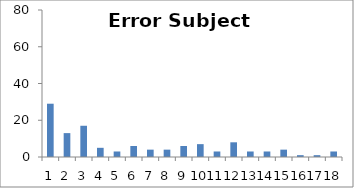
| Category | Sub13 |
|---|---|
| 0 | 29 |
| 1 | 13 |
| 2 | 17 |
| 3 | 5 |
| 4 | 3 |
| 5 | 6 |
| 6 | 4 |
| 7 | 4 |
| 8 | 6 |
| 9 | 7 |
| 10 | 3 |
| 11 | 8 |
| 12 | 3 |
| 13 | 3 |
| 14 | 4 |
| 15 | 1 |
| 16 | 1 |
| 17 | 3 |